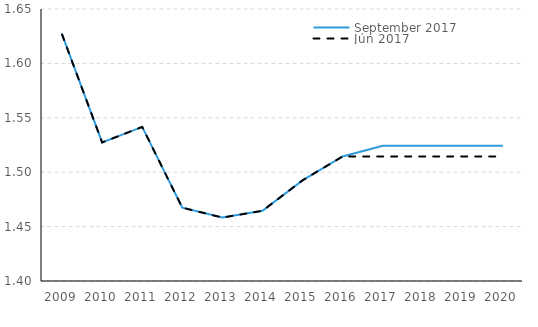
| Category | September 2017 | Jún 2017 |
|---|---|---|
| 2009.0 | 1.627 | 1.627 |
| 2010.0 | 1.527 | 1.527 |
| 2011.0 | 1.542 | 1.542 |
| 2012.0 | 1.467 | 1.467 |
| 2013.0 | 1.458 | 1.458 |
| 2014.0 | 1.465 | 1.465 |
| 2015.0 | 1.493 | 1.493 |
| 2016.0 | 1.514 | 1.514 |
| 2017.0 | 1.524 | 1.514 |
| 2018.0 | 1.524 | 1.514 |
| 2019.0 | 1.524 | 1.514 |
| 2020.0 | 1.524 | 1.514 |